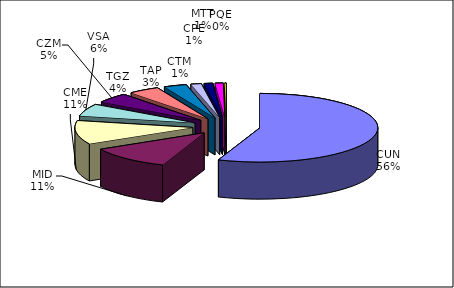
| Category | Series 0 |
|---|---|
| CUN | 214038 |
| MID | 43507 |
| CME | 42909 |
| VSA | 22238 |
| CZM | 17898 |
| TGZ | 16278 |
| TAP | 11986 |
| CTM | 5546 |
| CPE | 4529 |
| MTT | 4221 |
| PQE | 820 |